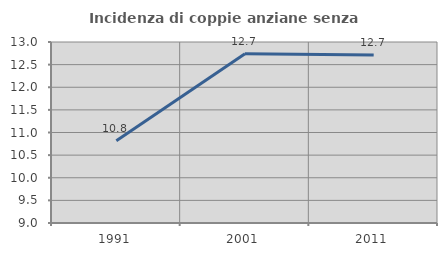
| Category | Incidenza di coppie anziane senza figli  |
|---|---|
| 1991.0 | 10.818 |
| 2001.0 | 12.741 |
| 2011.0 | 12.711 |